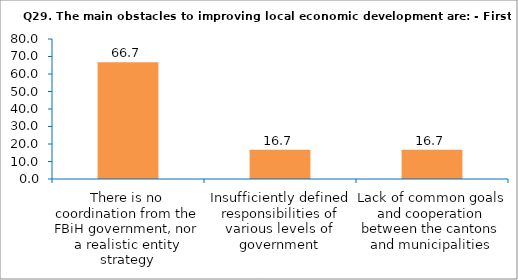
| Category | Series 0 |
|---|---|
| There is no coordination from the FBiH government, nor a realistic entity strategy | 66.667 |
| Insufficiently defined responsibilities of various levels of government | 16.667 |
| Lack of common goals and cooperation between the cantons and municipalities | 16.667 |